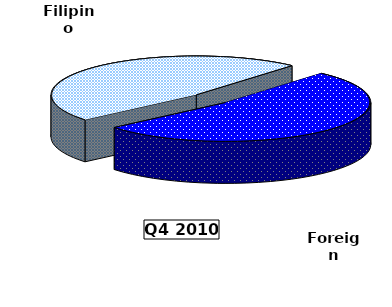
| Category | Series 0 |
|---|---|
| Filipino | 105.783 |
| Foreign | 116.631 |